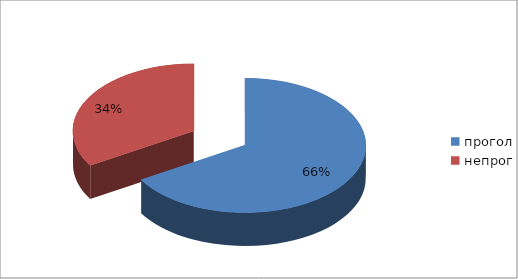
| Category | Series 0 |
|---|---|
| прогол | 81 |
| непрог | 41 |